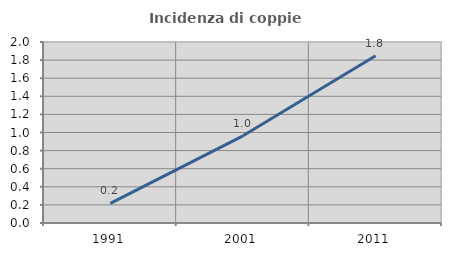
| Category | Incidenza di coppie miste |
|---|---|
| 1991.0 | 0.217 |
| 2001.0 | 0.963 |
| 2011.0 | 1.849 |